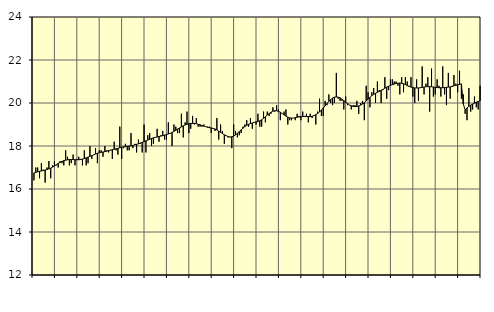
| Category | Piggar | Vård och omsorg, SNI 86-88 |
|---|---|---|
| nan | 16.4 | 16.75 |
| 1.0 | 17 | 16.77 |
| 1.0 | 17 | 16.8 |
| 1.0 | 16.5 | 16.82 |
| 1.0 | 17.2 | 16.84 |
| 1.0 | 16.9 | 16.86 |
| 1.0 | 16.3 | 16.88 |
| 1.0 | 17 | 16.91 |
| 1.0 | 17.3 | 16.94 |
| 1.0 | 16.5 | 16.97 |
| 1.0 | 17.1 | 17.02 |
| 1.0 | 17.3 | 17.07 |
| nan | 17.1 | 17.13 |
| 2.0 | 17 | 17.19 |
| 2.0 | 17.3 | 17.24 |
| 2.0 | 17.2 | 17.28 |
| 2.0 | 17.1 | 17.32 |
| 2.0 | 17.8 | 17.34 |
| 2.0 | 17.5 | 17.36 |
| 2.0 | 17.1 | 17.37 |
| 2.0 | 17.2 | 17.37 |
| 2.0 | 17.6 | 17.37 |
| 2.0 | 17.1 | 17.36 |
| 2.0 | 17.4 | 17.36 |
| nan | 17.5 | 17.36 |
| 3.0 | 17.4 | 17.37 |
| 3.0 | 17.1 | 17.39 |
| 3.0 | 17.8 | 17.42 |
| 3.0 | 17.1 | 17.45 |
| 3.0 | 17.2 | 17.48 |
| 3.0 | 18 | 17.52 |
| 3.0 | 17.4 | 17.55 |
| 3.0 | 17.6 | 17.59 |
| 3.0 | 17.9 | 17.63 |
| 3.0 | 17.2 | 17.66 |
| 3.0 | 17.8 | 17.69 |
| nan | 17.8 | 17.71 |
| 4.0 | 17.5 | 17.72 |
| 4.0 | 18 | 17.74 |
| 4.0 | 17.8 | 17.76 |
| 4.0 | 17.7 | 17.78 |
| 4.0 | 17.8 | 17.81 |
| 4.0 | 17.4 | 17.83 |
| 4.0 | 18.2 | 17.85 |
| 4.0 | 17.8 | 17.87 |
| 4.0 | 17.6 | 17.89 |
| 4.0 | 18.9 | 17.92 |
| 4.0 | 17.4 | 17.94 |
| nan | 17.9 | 17.96 |
| 5.0 | 18.1 | 17.97 |
| 5.0 | 17.8 | 17.99 |
| 5.0 | 17.8 | 18 |
| 5.0 | 18.6 | 18.01 |
| 5.0 | 17.9 | 18.02 |
| 5.0 | 18.1 | 18.05 |
| 5.0 | 17.7 | 18.08 |
| 5.0 | 18.3 | 18.1 |
| 5.0 | 18.1 | 18.14 |
| 5.0 | 17.7 | 18.17 |
| 5.0 | 19 | 18.2 |
| nan | 17.7 | 18.24 |
| 6.0 | 18.5 | 18.28 |
| 6.0 | 18.6 | 18.31 |
| 6.0 | 18 | 18.35 |
| 6.0 | 18.1 | 18.38 |
| 6.0 | 18.4 | 18.4 |
| 6.0 | 18.8 | 18.42 |
| 6.0 | 18.2 | 18.44 |
| 6.0 | 18.5 | 18.46 |
| 6.0 | 18.7 | 18.48 |
| 6.0 | 18.3 | 18.51 |
| 6.0 | 18.3 | 18.53 |
| nan | 19.1 | 18.56 |
| 7.0 | 18.6 | 18.59 |
| 7.0 | 18 | 18.63 |
| 7.0 | 19 | 18.68 |
| 7.0 | 18.9 | 18.73 |
| 7.0 | 18.6 | 18.79 |
| 7.0 | 18.6 | 18.84 |
| 7.0 | 19.5 | 18.89 |
| 7.0 | 18.4 | 18.94 |
| 7.0 | 19.1 | 18.98 |
| 7.0 | 19.6 | 19.01 |
| 7.0 | 18.6 | 19.04 |
| nan | 18.8 | 19.05 |
| 8.0 | 19.4 | 19.05 |
| 8.0 | 19 | 19.05 |
| 8.0 | 19.3 | 19.04 |
| 8.0 | 18.9 | 19.01 |
| 8.0 | 18.9 | 18.99 |
| 8.0 | 18.9 | 18.95 |
| 8.0 | 19 | 18.92 |
| 8.0 | 18.9 | 18.9 |
| 8.0 | 18.9 | 18.87 |
| 8.0 | 18.9 | 18.85 |
| 8.0 | 18.6 | 18.84 |
| nan | 18.8 | 18.82 |
| 9.0 | 18.7 | 18.79 |
| 9.0 | 19.3 | 18.75 |
| 9.0 | 18.3 | 18.69 |
| 9.0 | 19 | 18.64 |
| 9.0 | 18.7 | 18.58 |
| 9.0 | 18.1 | 18.52 |
| 9.0 | 18.5 | 18.48 |
| 9.0 | 18.4 | 18.44 |
| 9.0 | 18.4 | 18.42 |
| 9.0 | 17.9 | 18.43 |
| 9.0 | 19 | 18.46 |
| nan | 18.7 | 18.52 |
| 10.0 | 18.4 | 18.59 |
| 10.0 | 18.5 | 18.67 |
| 10.0 | 18.6 | 18.75 |
| 10.0 | 18.9 | 18.83 |
| 10.0 | 19 | 18.9 |
| 10.0 | 19.2 | 18.96 |
| 10.0 | 18.9 | 19.01 |
| 10.0 | 19.3 | 19.04 |
| 10.0 | 18.8 | 19.07 |
| 10.0 | 19.1 | 19.1 |
| 10.0 | 19 | 19.12 |
| nan | 19.5 | 19.14 |
| 11.0 | 18.9 | 19.17 |
| 11.0 | 18.9 | 19.22 |
| 11.0 | 19.6 | 19.29 |
| 11.0 | 19.1 | 19.36 |
| 11.0 | 19.6 | 19.44 |
| 11.0 | 19.4 | 19.51 |
| 11.0 | 19.5 | 19.57 |
| 11.0 | 19.8 | 19.62 |
| 11.0 | 19.6 | 19.64 |
| 11.0 | 19.9 | 19.64 |
| 11.0 | 19.7 | 19.61 |
| nan | 19.2 | 19.57 |
| 12.0 | 19.5 | 19.51 |
| 12.0 | 19.6 | 19.45 |
| 12.0 | 19.7 | 19.39 |
| 12.0 | 19 | 19.34 |
| 12.0 | 19.2 | 19.31 |
| 12.0 | 19.2 | 19.3 |
| 12.0 | 19.3 | 19.3 |
| 12.0 | 19.2 | 19.32 |
| 12.0 | 19.5 | 19.34 |
| 12.0 | 19.4 | 19.35 |
| 12.0 | 19.2 | 19.36 |
| nan | 19.6 | 19.37 |
| 13.0 | 19.4 | 19.37 |
| 13.0 | 19.5 | 19.37 |
| 13.0 | 19.1 | 19.37 |
| 13.0 | 19.5 | 19.37 |
| 13.0 | 19.3 | 19.38 |
| 13.0 | 19.4 | 19.41 |
| 13.0 | 19 | 19.46 |
| 13.0 | 19.6 | 19.51 |
| 13.0 | 20.2 | 19.58 |
| 13.0 | 19.4 | 19.67 |
| 13.0 | 19.4 | 19.77 |
| nan | 20.1 | 19.87 |
| 14.0 | 19.9 | 19.98 |
| 14.0 | 20.4 | 20.08 |
| 14.0 | 20 | 20.16 |
| 14.0 | 19.9 | 20.23 |
| 14.0 | 20 | 20.27 |
| 14.0 | 21.4 | 20.28 |
| 14.0 | 20.2 | 20.27 |
| 14.0 | 20.1 | 20.24 |
| 14.0 | 20.1 | 20.18 |
| 14.0 | 19.7 | 20.11 |
| 14.0 | 20.3 | 20.04 |
| nan | 19.9 | 19.98 |
| 15.0 | 19.9 | 19.91 |
| 15.0 | 19.7 | 19.87 |
| 15.0 | 19.9 | 19.84 |
| 15.0 | 19.9 | 19.83 |
| 15.0 | 20.1 | 19.84 |
| 15.0 | 19.5 | 19.86 |
| 15.0 | 20 | 19.9 |
| 15.0 | 20.1 | 19.95 |
| 15.0 | 19.2 | 20.02 |
| 15.0 | 20.8 | 20.1 |
| 15.0 | 20.5 | 20.18 |
| nan | 19.8 | 20.26 |
| 16.0 | 20.5 | 20.34 |
| 16.0 | 20.7 | 20.4 |
| 16.0 | 20 | 20.45 |
| 16.0 | 21 | 20.5 |
| 16.0 | 20.6 | 20.54 |
| 16.0 | 20 | 20.59 |
| 16.0 | 20.6 | 20.63 |
| 16.0 | 21.2 | 20.69 |
| 16.0 | 20.2 | 20.74 |
| 16.0 | 20.6 | 20.78 |
| 16.0 | 21.1 | 20.82 |
| nan | 21.1 | 20.85 |
| 17.0 | 21 | 20.88 |
| 17.0 | 21 | 20.91 |
| 17.0 | 20.8 | 20.92 |
| 17.0 | 20.4 | 20.93 |
| 17.0 | 21.2 | 20.92 |
| 17.0 | 20.5 | 20.89 |
| 17.0 | 21.2 | 20.86 |
| 17.0 | 21 | 20.81 |
| 17.0 | 20.8 | 20.77 |
| 17.0 | 21.2 | 20.74 |
| 17.0 | 20.3 | 20.72 |
| nan | 20 | 20.7 |
| 18.0 | 21.1 | 20.7 |
| 18.0 | 20.1 | 20.7 |
| 18.0 | 20.7 | 20.71 |
| 18.0 | 21.7 | 20.73 |
| 18.0 | 20.4 | 20.74 |
| 18.0 | 20.9 | 20.76 |
| 18.0 | 21.2 | 20.76 |
| 18.0 | 19.6 | 20.76 |
| 18.0 | 21.6 | 20.76 |
| 18.0 | 20.3 | 20.74 |
| 18.0 | 20.4 | 20.73 |
| nan | 21.1 | 20.72 |
| 19.0 | 20.8 | 20.71 |
| 19.0 | 20.3 | 20.71 |
| 19.0 | 21.7 | 20.71 |
| 19.0 | 20.4 | 20.72 |
| 19.0 | 19.9 | 20.73 |
| 19.0 | 21.4 | 20.74 |
| 19.0 | 20.2 | 20.75 |
| 19.0 | 20.8 | 20.77 |
| 19.0 | 21.3 | 20.8 |
| 19.0 | 20.9 | 20.82 |
| 19.0 | 20.5 | 20.85 |
| nan | 21.5 | 20.87 |
| 20.0 | 20.2 | 20.89 |
| 20.0 | 20.4 | 19.96 |
| 20.0 | 19.5 | 19.68 |
| 20.0 | 19.2 | 19.77 |
| 20.0 | 20.7 | 19.84 |
| 20.0 | 19.6 | 19.9 |
| 20.0 | 19.7 | 19.95 |
| 20.0 | 20.3 | 19.99 |
| 20.0 | 19.8 | 20.04 |
| 20.0 | 19.7 | 20.07 |
| 20.0 | 20.8 | 20.1 |